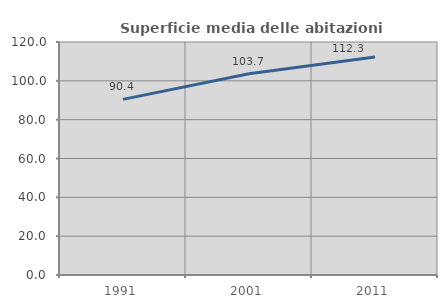
| Category | Superficie media delle abitazioni occupate |
|---|---|
| 1991.0 | 90.441 |
| 2001.0 | 103.665 |
| 2011.0 | 112.308 |